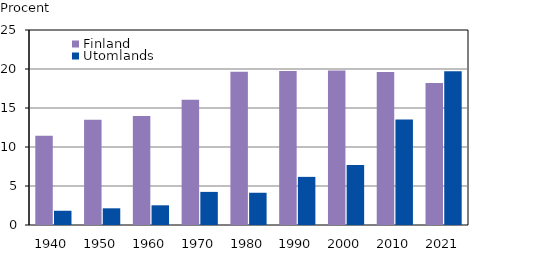
| Category | Finland  | Utomlands |
|---|---|---|
| 1940.0 | 11.455 | 1.826 |
| 1950.0 | 13.49 | 2.139 |
| 1960.0 | 13.965 | 2.526 |
| 1970.0 | 16.046 | 4.244 |
| 1980.0 | 19.651 | 4.135 |
| 1990.0 | 19.741 | 6.17 |
| 2000.0 | 19.821 | 7.701 |
| 2010.0 | 19.602 | 13.514 |
| 2021.0 | 18.221 | 19.697 |